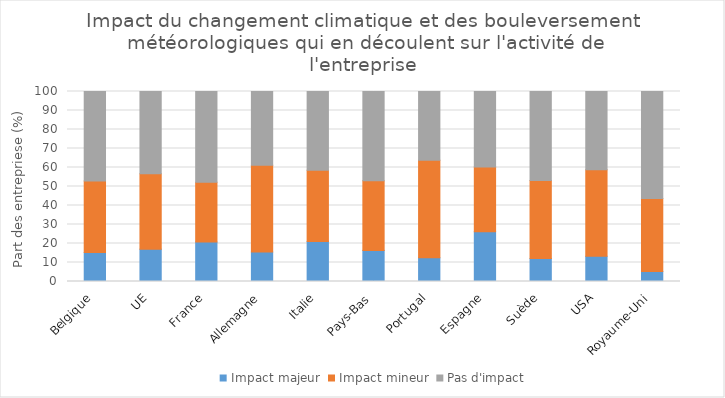
| Category | Impact majeur | Impact mineur | Pas d'impact |
|---|---|---|---|
|   Belgique | 15.22 | 37.64 | 47.14 |
|   UE | 17.02 | 39.7 | 43.28 |
|   France | 20.79 | 31.51 | 47.7 |
|   Allemagne | 15.5 | 45.69 | 38.82 |
|   Italie | 21.01 | 37.49 | 41.5 |
|   Pays-Bas | 16.38 | 36.6 | 47.02 |
|   Portugal | 12.5 | 51.29 | 36.21 |
|   Espagne | 26.15 | 34.12 | 39.73 |
|   Suède | 12.13 | 41.06 | 46.82 |
|   USA | 13.25 | 45.62 | 41.14 |
| Royaume-Uni | 5.28 | 38.38 | 56.34 |